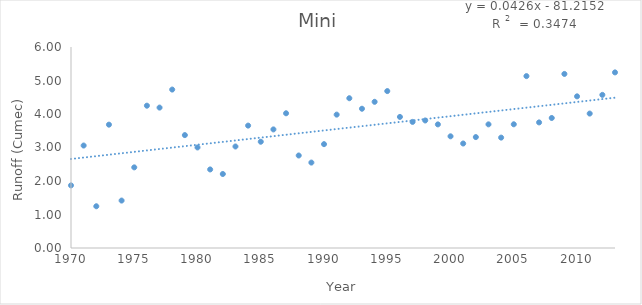
| Category | Mini |
|---|---|
| 1970.0 | 1.869 |
| 1971.0 | 3.059 |
| 1972.0 | 1.246 |
| 1973.0 | 3.682 |
| 1974.0 | 1.416 |
| 1975.0 | 2.407 |
| 1976.0 | 4.248 |
| 1977.0 | 4.191 |
| 1978.0 | 4.73 |
| 1979.0 | 3.37 |
| 1980.0 | 3.002 |
| 1981.0 | 2.345 |
| 1982.0 | 2.209 |
| 1983.0 | 3.03 |
| 1984.0 | 3.653 |
| 1985.0 | 3.172 |
| 1986.0 | 3.54 |
| 1987.0 | 4.022 |
| 1988.0 | 2.761 |
| 1989.0 | 2.55 |
| 1990.0 | 3.1 |
| 1991.0 | 3.981 |
| 1992.0 | 4.471 |
| 1993.0 | 4.157 |
| 1994.0 | 4.364 |
| 1995.0 | 4.684 |
| 1996.0 | 3.913 |
| 1997.0 | 3.764 |
| 1998.0 | 3.807 |
| 1999.0 | 3.69 |
| 2000.0 | 3.334 |
| 2001.0 | 3.119 |
| 2002.0 | 3.311 |
| 2003.0 | 3.691 |
| 2004.0 | 3.295 |
| 2005.0 | 3.693 |
| 2006.0 | 5.131 |
| 2007.0 | 3.749 |
| 2008.0 | 3.881 |
| 2009.0 | 5.196 |
| 2010.0 | 4.527 |
| 2011.0 | 4.013 |
| 2012.0 | 4.571 |
| 2013.0 | 5.242 |